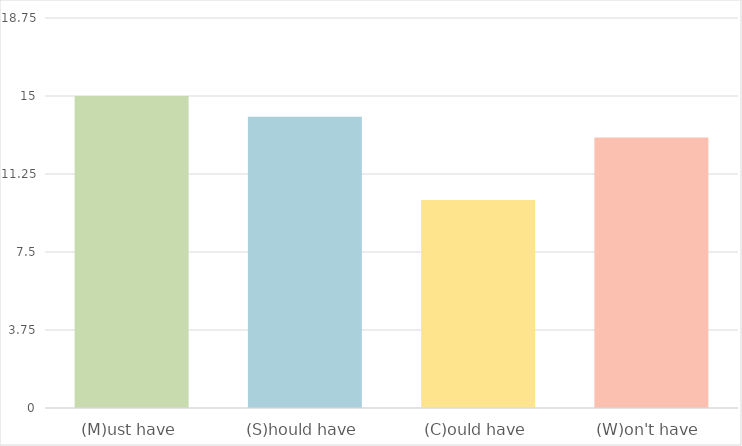
| Category | Series 0 |
|---|---|
| (M)ust have | 15 |
| (S)hould have | 14 |
| (C)ould have | 10 |
| (W)on't have | 13 |